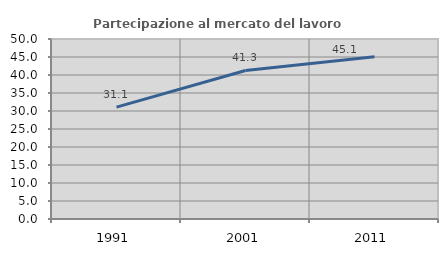
| Category | Partecipazione al mercato del lavoro  femminile |
|---|---|
| 1991.0 | 31.081 |
| 2001.0 | 41.253 |
| 2011.0 | 45.09 |